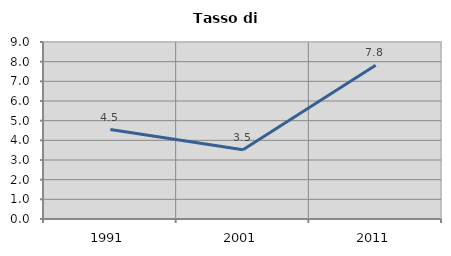
| Category | Tasso di disoccupazione   |
|---|---|
| 1991.0 | 4.545 |
| 2001.0 | 3.52 |
| 2011.0 | 7.82 |